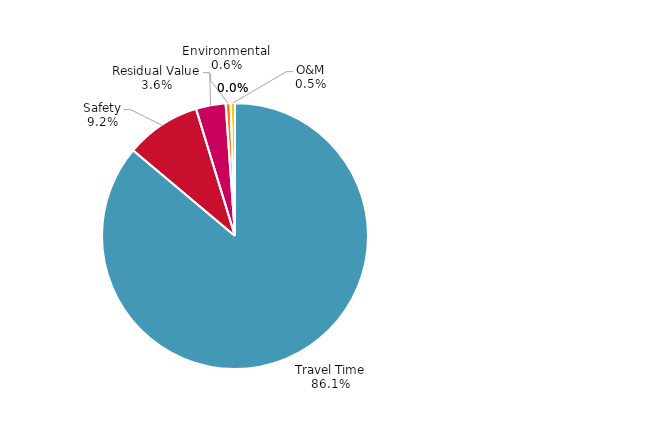
| Category | Series 0 |
|---|---|
| Travel Time | 307569369.516 |
| Safety | 32671402.936 |
| Residual Value | 12870394.324 |
| Environmental | 2168180.107 |
| O&M | 1868323.516 |